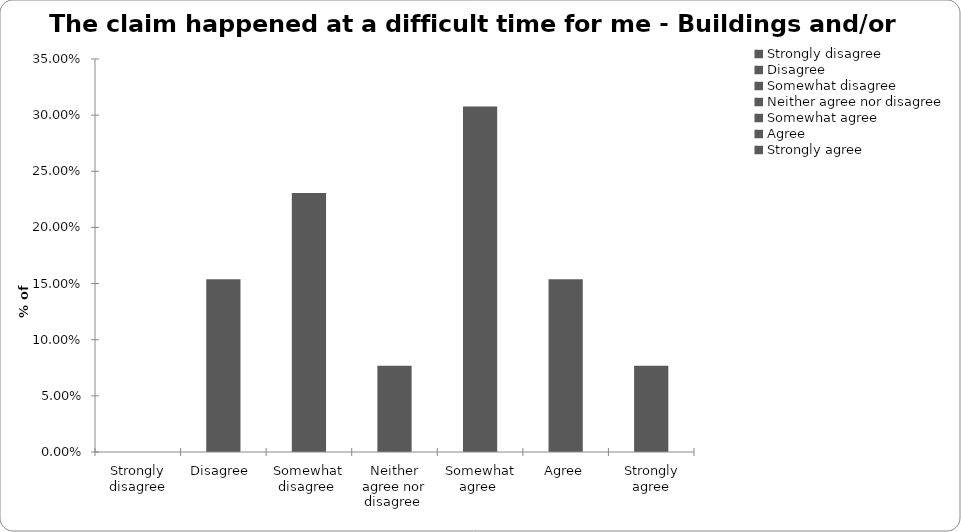
| Category | Series 1 |
|---|---|
| Strongly disagree | 0 |
| Disagree  | 0.154 |
| Somewhat disagree  | 0.231 |
| Neither agree nor disagree  | 0.077 |
| Somewhat agree  | 0.308 |
| Agree | 0.154 |
| Strongly agree | 0.077 |